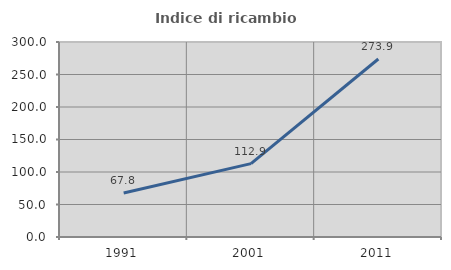
| Category | Indice di ricambio occupazionale  |
|---|---|
| 1991.0 | 67.792 |
| 2001.0 | 112.932 |
| 2011.0 | 273.872 |